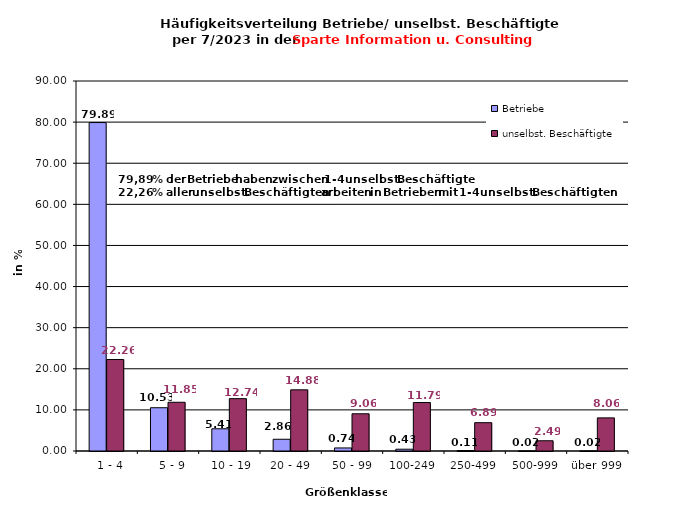
| Category | Betriebe | unselbst. Beschäftigte |
|---|---|---|
|   1 - 4 | 79.888 | 22.258 |
|   5 - 9 | 10.526 | 11.851 |
|  10 - 19 | 5.408 | 12.736 |
| 20 - 49 | 2.858 | 14.876 |
| 50 - 99 | 0.742 | 9.056 |
| 100-249 | 0.434 | 11.788 |
| 250-499 | 0.109 | 6.89 |
| 500-999 | 0.018 | 2.49 |
| über 999 | 0.018 | 8.055 |